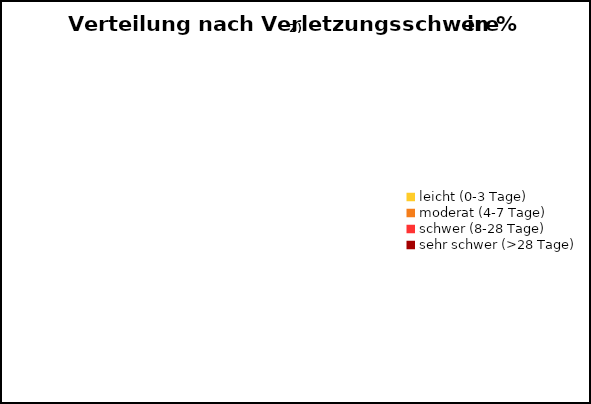
| Category | Series 0 |
|---|---|
| leicht (0-3 Tage) | 0 |
| moderat (4-7 Tage) | 0 |
| schwer (8-28 Tage) | 0 |
| sehr schwer (>28 Tage) | 0 |